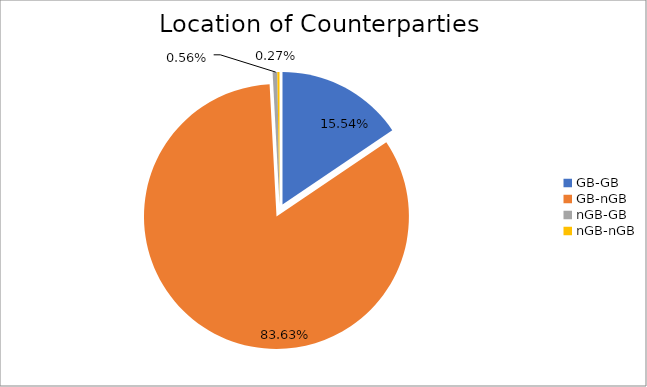
| Category | Series 0 |
|---|---|
| GB-GB | 1243356.338 |
| GB-nGB | 6690926.823 |
| nGB-GB | 45062.039 |
| nGB-nGB | 21320.137 |